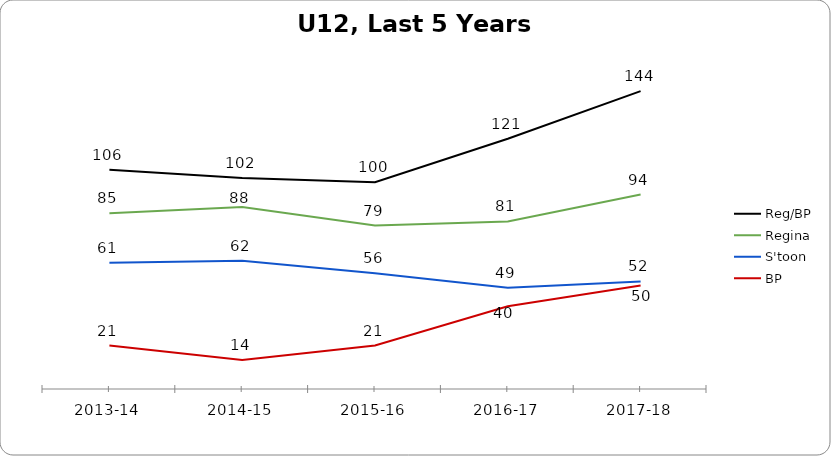
| Category | Reg/BP | Regina | S'toon | BP |
|---|---|---|---|---|
| 2013-14 | 106 | 85 | 61 | 21 |
| 2014-15 | 102 | 88 | 62 | 14 |
| 2015-16 | 100 | 79 | 56 | 21 |
| 2016-17 | 121 | 81 | 49 | 40 |
| 2017-18 | 144 | 94 | 52 | 50 |